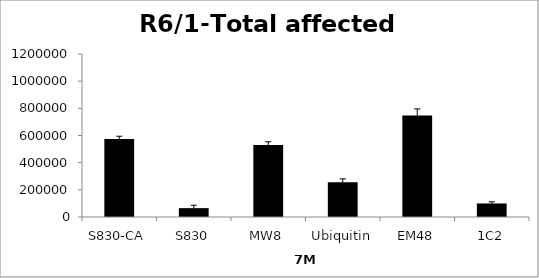
| Category | Series 0 |
|---|---|
| S830-CA | 573751.749 |
| S830 | 65182.342 |
| MW8 | 530353.15 |
| Ubiquitin | 256655.572 |
| EM48 | 747741.831 |
| 1C2 | 99544.782 |